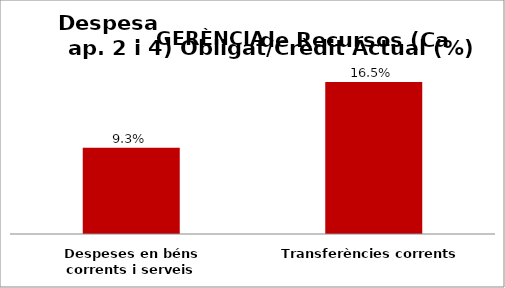
| Category | Series 0 |
|---|---|
| Despeses en béns corrents i serveis | 0.093 |
| Transferències corrents | 0.165 |